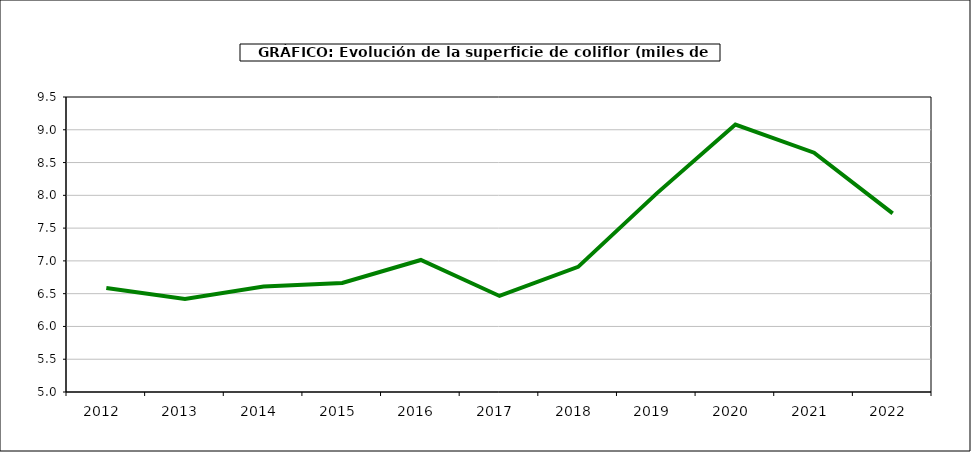
| Category | superficie |
|---|---|
| 2012.0 | 6.587 |
| 2013.0 | 6.418 |
| 2014.0 | 6.61 |
| 2015.0 | 6.664 |
| 2016.0 | 7.014 |
| 2017.0 | 6.465 |
| 2018.0 | 6.909 |
| 2019.0 | 8.03 |
| 2020.0 | 9.079 |
| 2021.0 | 8.651 |
| 2022.0 | 7.726 |